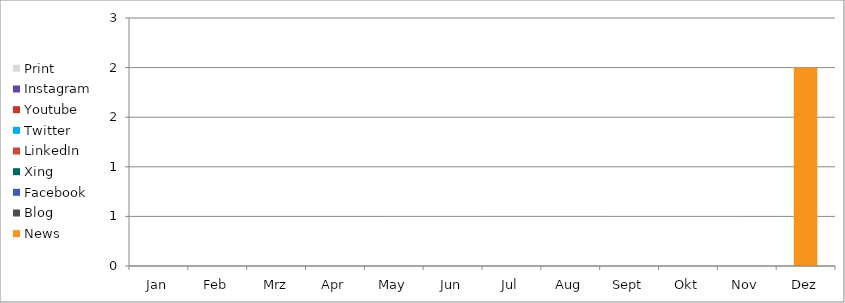
| Category | News | Blog | Facebook | Xing | LinkedIn | Twitter | Youtube | Instagram | Print |
|---|---|---|---|---|---|---|---|---|---|
| Jan | 0 | 0 | 0 | 0 | 0 | 0 | 0 | 0 | 0 |
| Feb | 0 | 0 | 0 | 0 | 0 | 0 | 0 | 0 | 0 |
| Mrz | 0 | 0 | 0 | 0 | 0 | 0 | 0 | 0 | 0 |
| Apr | 0 | 0 | 0 | 0 | 0 | 0 | 0 | 0 | 0 |
| May | 0 | 0 | 0 | 0 | 0 | 0 | 0 | 0 | 0 |
| Jun | 0 | 0 | 0 | 0 | 0 | 0 | 0 | 0 | 0 |
| Jul | 0 | 0 | 0 | 0 | 0 | 0 | 0 | 0 | 0 |
| Aug | 0 | 0 | 0 | 0 | 0 | 0 | 0 | 0 | 0 |
| Sept | 0 | 0 | 0 | 0 | 0 | 0 | 0 | 0 | 0 |
| Okt | 0 | 0 | 0 | 0 | 0 | 0 | 0 | 0 | 0 |
| Nov | 0 | 0 | 0 | 0 | 0 | 0 | 0 | 0 | 0 |
| Dez | 2 | 0 | 0 | 0 | 0 | 0 | 0 | 0 | 0 |